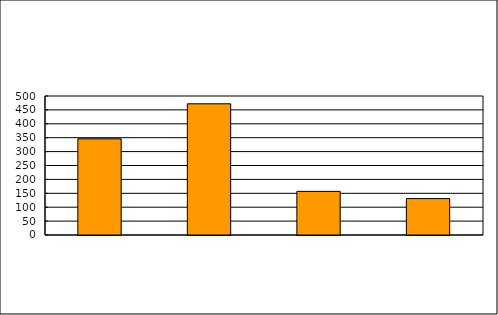
| Category | Series 0 |
|---|---|
| 0 | 346 |
| 1 | 472 |
| 2 | 157 |
| 3 | 131 |